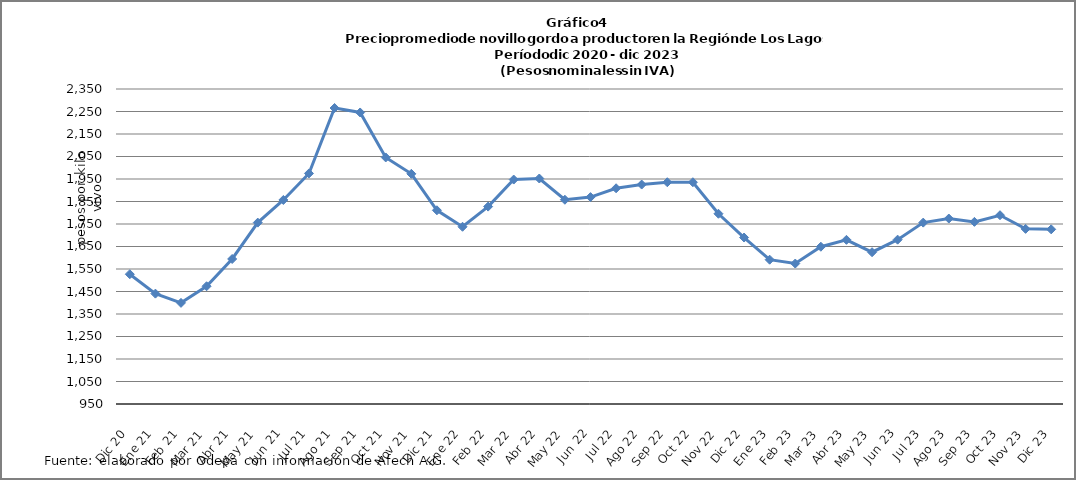
| Category | Series 0 |
|---|---|
| Dic 20 | 1526.87 |
| Ene 21 | 1440.52 |
| Feb 21 | 1399.49 |
| Mar 21 | 1473.37 |
| Abr 21 | 1594.53 |
| May 21 | 1756.14 |
| Jun 21 | 1856.82 |
| Jul 21 | 1974.76 |
| Ago 21 | 2265.55 |
| Sep 21 | 2245.66 |
| Oct 21 | 2045.7 |
| Nov 21 | 1973.04 |
| Dic 21 | 1810.96 |
| Ene 22 | 1737.66 |
| Feb 22 | 1827.33 |
| Mar 22 | 1947.55 |
| Abr 22 | 1952.2 |
| May 22 | 1857.79 |
| Jun 22 | 1869.55 |
| Jul 22 | 1908.78 |
| Ago 22 | 1925.28 |
| Sep 22 | 1935.59 |
| Oct 22 | 1935.58 |
| Nov 22 | 1795.5 |
| Dic 22 | 1689.88 |
| Ene 23 | 1591.34 |
| Feb 23 | 1574.29 |
| Mar 23 | 1649.02 |
| Abr 23 | 1679.6 |
| May 23 | 1624.61 |
| Jun 23 | 1680.46 |
| Jul 23 | 1756.15 |
| Ago 23 | 1774.3 |
| Sep 23 | 1759.46 |
| Oct 23 | 1788.961 |
| Nov 23 | 1728.37 |
| Dic 23 | 1726.195 |